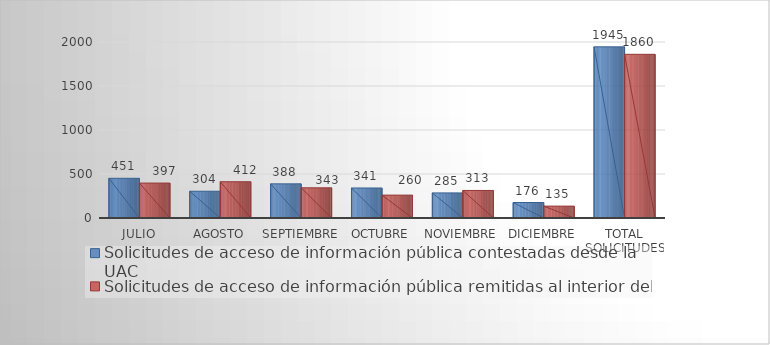
| Category | Solicitudes de acceso de información pública contestadas desde la UAC | Solicitudes de acceso de información pública remitidas al interior del Congreso |
|---|---|---|
| JULIO | 451 | 397 |
| AGOSTO | 304 | 412 |
| SEPTIEMBRE | 388 | 343 |
| OCTUBRE | 341 | 260 |
| NOVIEMBRE | 285 | 313 |
| DICIEMBRE | 176 | 135 |
| TOTAL SOLICITUDES | 1945 | 1860 |